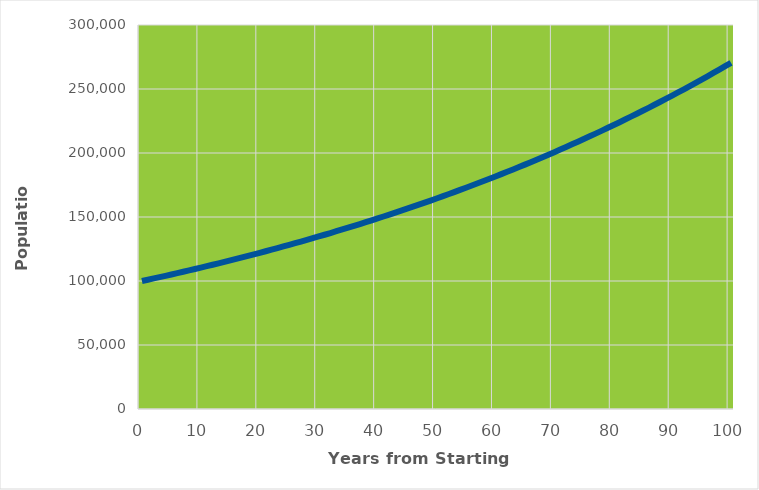
| Category | Population |
|---|---|
| 0.0 | 100000 |
| 1.0 | 101000 |
| 2.0 | 102010 |
| 3.0 | 103030.1 |
| 4.0 | 104060.401 |
| 5.0 | 105101.005 |
| 6.0 | 106152.015 |
| 7.0 | 107213.535 |
| 8.0 | 108285.671 |
| 9.0 | 109368.527 |
| 10.0 | 110462.213 |
| 11.0 | 111566.835 |
| 12.0 | 112682.503 |
| 13.0 | 113809.328 |
| 14.0 | 114947.421 |
| 15.0 | 116096.896 |
| 16.0 | 117257.864 |
| 17.0 | 118430.443 |
| 18.0 | 119614.748 |
| 19.0 | 120810.895 |
| 20.0 | 122019.004 |
| 21.0 | 123239.194 |
| 22.0 | 124471.586 |
| 23.0 | 125716.302 |
| 24.0 | 126973.465 |
| 25.0 | 128243.2 |
| 26.0 | 129525.631 |
| 27.0 | 130820.888 |
| 28.0 | 132129.097 |
| 29.0 | 133450.388 |
| 30.0 | 134784.892 |
| 31.0 | 136132.74 |
| 32.0 | 137494.068 |
| 33.0 | 138869.009 |
| 34.0 | 140257.699 |
| 35.0 | 141660.276 |
| 36.0 | 143076.878 |
| 37.0 | 144507.647 |
| 38.0 | 145952.724 |
| 39.0 | 147412.251 |
| 40.0 | 148886.373 |
| 41.0 | 150375.237 |
| 42.0 | 151878.989 |
| 43.0 | 153397.779 |
| 44.0 | 154931.757 |
| 45.0 | 156481.075 |
| 46.0 | 158045.885 |
| 47.0 | 159626.344 |
| 48.0 | 161222.608 |
| 49.0 | 162834.834 |
| 50.0 | 164463.182 |
| 51.0 | 166107.814 |
| 52.0 | 167768.892 |
| 53.0 | 169446.581 |
| 54.0 | 171141.047 |
| 55.0 | 172852.457 |
| 56.0 | 174580.982 |
| 57.0 | 176326.792 |
| 58.0 | 178090.06 |
| 59.0 | 179870.96 |
| 60.0 | 181669.67 |
| 61.0 | 183486.367 |
| 62.0 | 185321.23 |
| 63.0 | 187174.443 |
| 64.0 | 189046.187 |
| 65.0 | 190936.649 |
| 66.0 | 192846.015 |
| 67.0 | 194774.475 |
| 68.0 | 196722.22 |
| 69.0 | 198689.442 |
| 70.0 | 200676.337 |
| 71.0 | 202683.1 |
| 72.0 | 204709.931 |
| 73.0 | 206757.031 |
| 74.0 | 208824.601 |
| 75.0 | 210912.847 |
| 76.0 | 213021.975 |
| 77.0 | 215152.195 |
| 78.0 | 217303.717 |
| 79.0 | 219476.754 |
| 80.0 | 221671.522 |
| 81.0 | 223888.237 |
| 82.0 | 226127.119 |
| 83.0 | 228388.39 |
| 84.0 | 230672.274 |
| 85.0 | 232978.997 |
| 86.0 | 235308.787 |
| 87.0 | 237661.875 |
| 88.0 | 240038.494 |
| 89.0 | 242438.879 |
| 90.0 | 244863.267 |
| 91.0 | 247311.9 |
| 92.0 | 249785.019 |
| 93.0 | 252282.869 |
| 94.0 | 254805.698 |
| 95.0 | 257353.755 |
| 96.0 | 259927.293 |
| 97.0 | 262526.565 |
| 98.0 | 265151.831 |
| 99.0 | 267803.349 |
| 100.0 | 270481.383 |